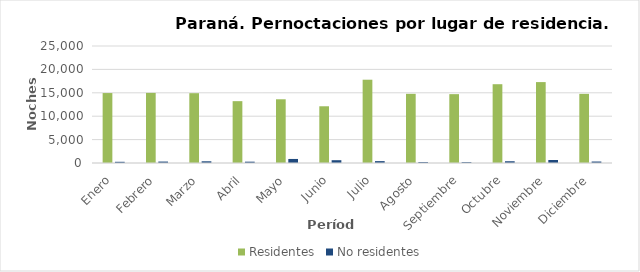
| Category | Residentes | No residentes |
|---|---|---|
| Enero | 14945 | 257 |
| Febrero | 14979 | 307 |
| Marzo | 14916 | 365 |
| Abril | 13214 | 283 |
| Mayo | 13615 | 864 |
| Junio | 12122 | 597 |
| Julio | 17796 | 400 |
| Agosto | 14781 | 202 |
| Septiembre | 14713 | 188 |
| Octubre | 16836 | 374 |
| Noviembre | 17288 | 636 |
| Diciembre | 14776 | 315 |